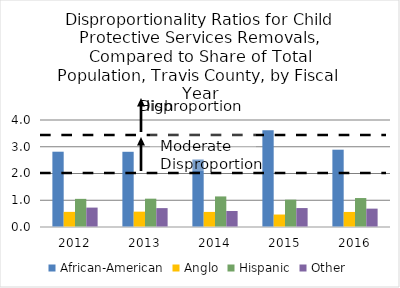
| Category | African-American | Anglo | Hispanic | Other |
|---|---|---|---|---|
| 2012.0 | 2.815 | 0.566 | 1.052 | 0.725 |
| 2013.0 | 2.812 | 0.574 | 1.059 | 0.706 |
| 2014.0 | 2.523 | 0.564 | 1.143 | 0.599 |
| 2015.0 | 3.62 | 0.466 | 1.022 | 0.708 |
| 2016.0 | 2.89 | 0.563 | 1.083 | 0.687 |